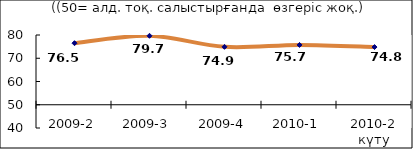
| Category | Диф.индекс ↓ |
|---|---|
| 2009-2 | 76.485 |
| 2009-3 | 79.66 |
| 2009-4 | 74.905 |
| 2010-1 | 75.725 |
| 2010-2 күту | 74.815 |